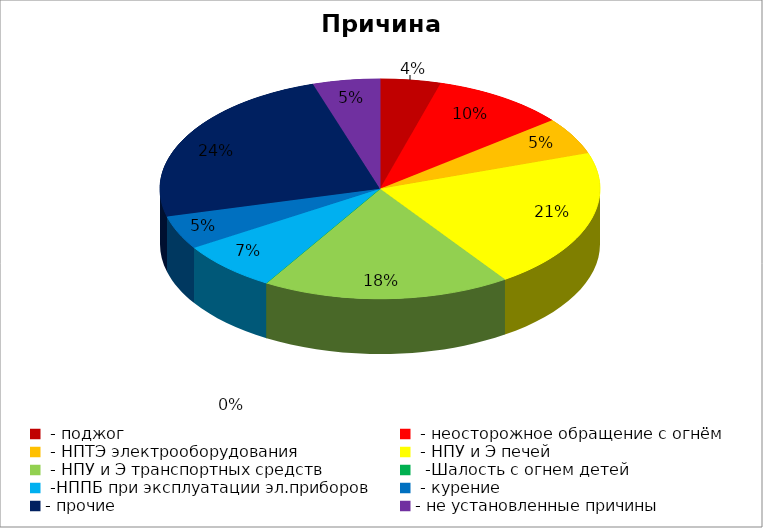
| Category | Причина пожара |
|---|---|
|  - поджог | 9 |
|  - неосторожное обращение с огнём | 20 |
|  - НПТЭ электрооборудования | 11 |
|  - НПУ и Э печей | 42 |
|  - НПУ и Э транспортных средств | 37 |
|   -Шалость с огнем детей | 0 |
|  -НППБ при эксплуатации эл.приборов | 15 |
|  - курение | 10 |
| - прочие | 49 |
| - не установленные причины | 10 |